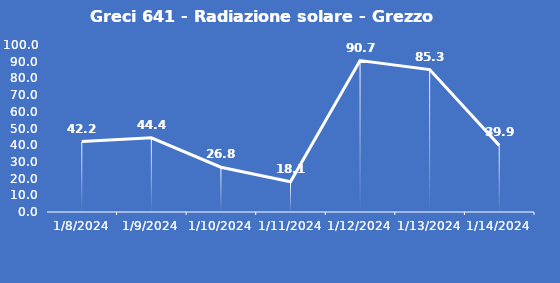
| Category | Greci 641 - Radiazione solare - Grezzo (W/m2) |
|---|---|
| 1/8/24 | 42.2 |
| 1/9/24 | 44.4 |
| 1/10/24 | 26.8 |
| 1/11/24 | 18.1 |
| 1/12/24 | 90.7 |
| 1/13/24 | 85.3 |
| 1/14/24 | 39.9 |